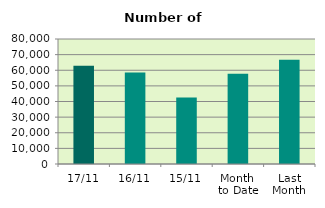
| Category | Series 0 |
|---|---|
| 17/11 | 62870 |
| 16/11 | 58568 |
| 15/11 | 42568 |
| Month 
to Date | 57722.615 |
| Last
Month | 66688.857 |